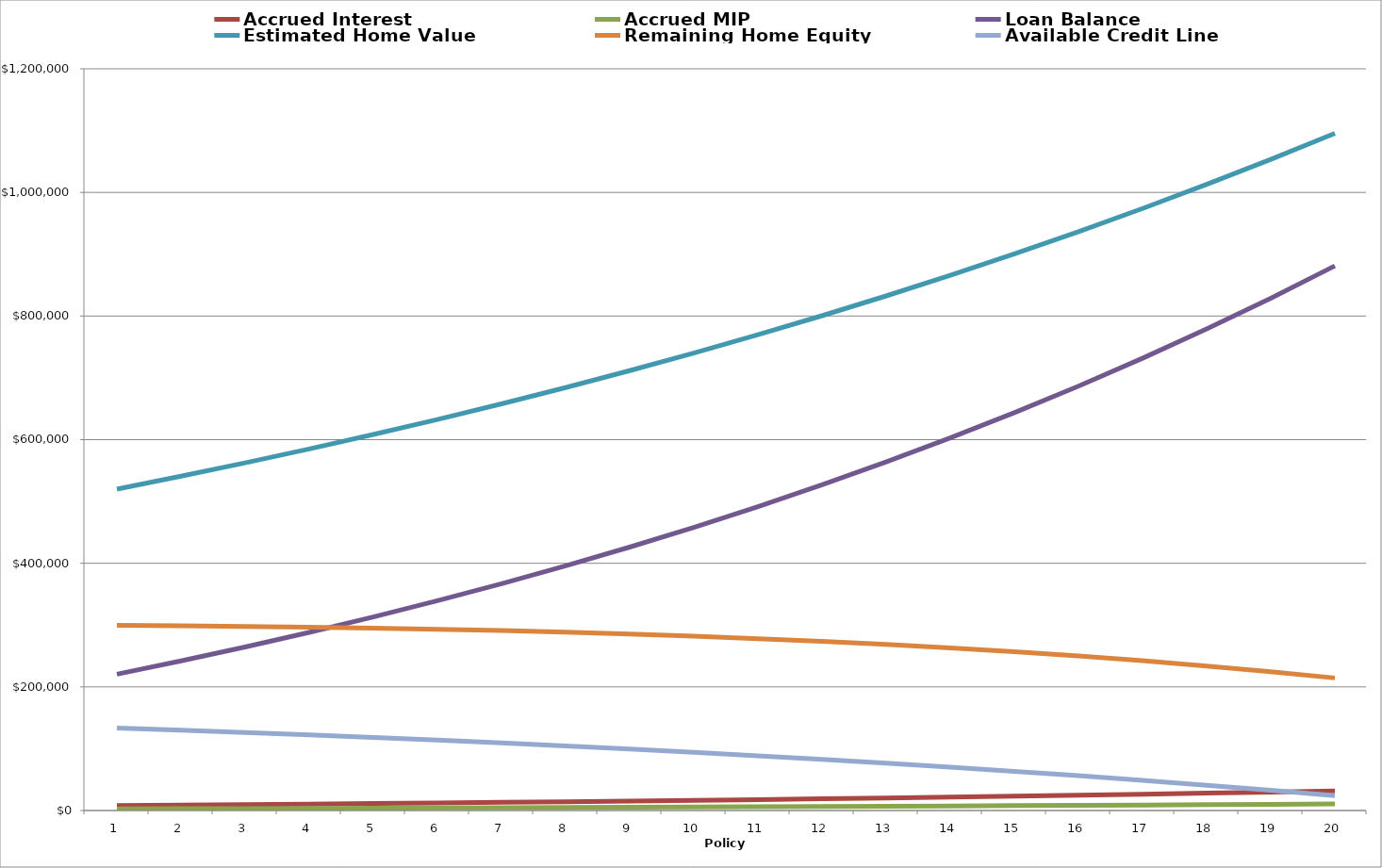
| Category | Accrued Interest | Accrued MIP | Loan Balance | Estimated Home Value | Remaining Home Equity | Available Credit Line |
|---|---|---|---|---|---|---|
| 1.0 | 7912.173 | 2673.032 | 220461.205 | 520000 | 299538.795 | 133604.009 |
| 2.0 | 8686.652 | 2934.68 | 241958.537 | 540800 | 298841.463 | 130036.05 |
| 3.0 | 9500.35 | 3209.578 | 264544.464 | 562432 | 297887.536 | 126287.414 |
| 4.0 | 10355.251 | 3498.396 | 288274.111 | 584929.28 | 296655.169 | 122348.953 |
| 5.0 | 11253.444 | 3801.839 | 313205.395 | 608326.451 | 295121.056 | 118211.054 |
| 6.0 | 12197.121 | 4120.649 | 339399.164 | 632659.509 | 293260.345 | 113863.616 |
| 7.0 | 13188.583 | 4455.602 | 366919.35 | 657965.89 | 291046.54 | 109296.031 |
| 8.0 | 14230.252 | 4807.518 | 395833.12 | 684284.525 | 288451.405 | 104497.15 |
| 9.0 | 15324.67 | 5177.253 | 426211.043 | 711655.906 | 285444.863 | 99455.26 |
| 10.0 | 16474.507 | 5565.712 | 458127.262 | 740122.142 | 281994.88 | 94158.055 |
| 11.0 | 17682.571 | 5973.842 | 491659.675 | 769727.028 | 278067.353 | 88592.607 |
| 12.0 | 18951.809 | 6402.638 | 526890.122 | 800516.109 | 273625.987 | 82745.333 |
| 13.0 | 20285.32 | 6853.149 | 563904.591 | 832536.754 | 268632.163 | 76601.961 |
| 14.0 | 21686.358 | 7326.472 | 602793.421 | 865838.224 | 263044.803 | 70147.497 |
| 15.0 | 23158.342 | 7823.764 | 643651.527 | 900471.753 | 256820.225 | 63366.188 |
| 16.0 | 24704.866 | 8346.239 | 686578.632 | 936490.623 | 249911.991 | 56241.483 |
| 17.0 | 26329.704 | 8895.17 | 731679.506 | 973950.248 | 242270.742 | 48755.992 |
| 18.0 | 28036.821 | 9471.899 | 779064.226 | 1012908.258 | 233844.032 | 40891.447 |
| 19.0 | 29830.384 | 10077.832 | 828848.442 | 1053424.588 | 224576.146 | 32628.652 |
| 20.0 | 31714.771 | 10714.45 | 881153.663 | 1095561.572 | 214407.909 | 23947.44 |